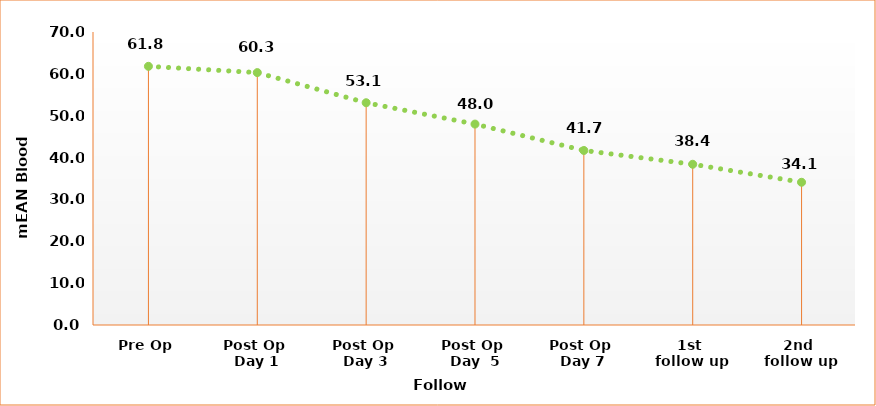
| Category | Series 0 |
|---|---|
| Pre Op | 61.8 |
| Post Op 
Day 1 | 60.3 |
| Post Op 
Day 3 | 53.1 |
| Post Op 
Day  5 | 48 |
| Post Op 
Day 7 | 41.7 |
| 1st 
follow up | 38.4 |
| 2nd 
follow up | 34.1 |